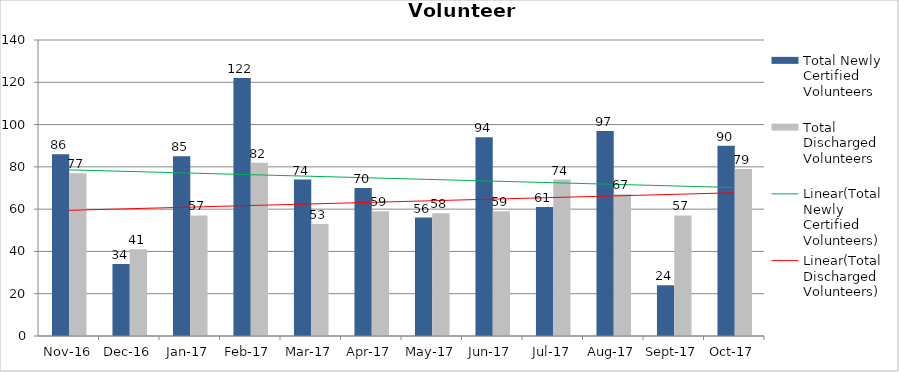
| Category | Total Newly Certified Volunteers | Total Discharged Volunteers |
|---|---|---|
| 2016-11-01 | 86 | 77 |
| 2016-12-01 | 34 | 41 |
| 2017-01-01 | 85 | 57 |
| 2017-02-01 | 122 | 82 |
| 2017-03-01 | 74 | 53 |
| 2017-04-01 | 70 | 59 |
| 2017-05-01 | 56 | 58 |
| 2017-06-01 | 94 | 59 |
| 2017-07-01 | 61 | 74 |
| 2017-08-01 | 97 | 67 |
| 2017-09-01 | 24 | 57 |
| 2017-10-01 | 90 | 79 |